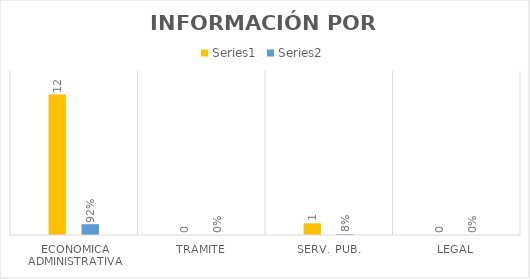
| Category | Series 3 | Series 4 |
|---|---|---|
| ECONOMICA ADMINISTRATIVA | 12 | 0.923 |
| TRAMITE | 0 | 0 |
| SERV. PUB. | 1 | 0.077 |
| LEGAL | 0 | 0 |